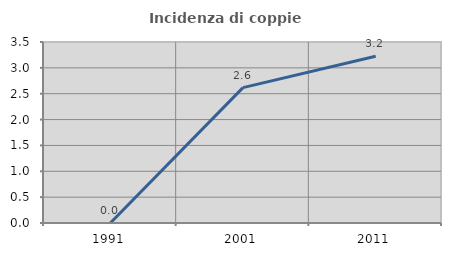
| Category | Incidenza di coppie miste |
|---|---|
| 1991.0 | 0 |
| 2001.0 | 2.618 |
| 2011.0 | 3.226 |